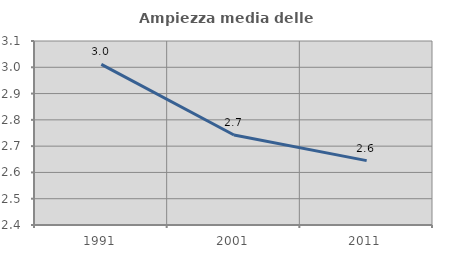
| Category | Ampiezza media delle famiglie |
|---|---|
| 1991.0 | 3.011 |
| 2001.0 | 2.743 |
| 2011.0 | 2.645 |